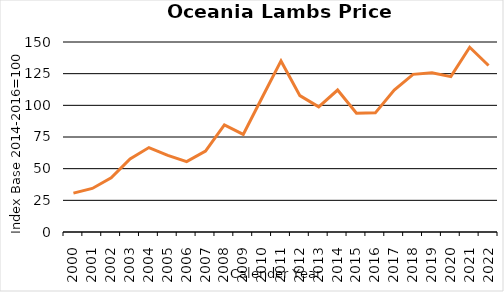
| Category | AU, NZ |
|---|---|
| 2000.0 | 30.663 |
| 2001.0 | 34.387 |
| 2002.0 | 42.754 |
| 2003.0 | 57.737 |
| 2004.0 | 66.657 |
| 2005.0 | 60.439 |
| 2006.0 | 55.515 |
| 2007.0 | 63.918 |
| 2008.0 | 84.597 |
| 2009.0 | 77.032 |
| 2010.0 | 106.15 |
| 2011.0 | 135.055 |
| 2012.0 | 107.658 |
| 2013.0 | 98.758 |
| 2014.0 | 112.087 |
| 2015.0 | 93.843 |
| 2016.0 | 94.069 |
| 2017.0 | 112.095 |
| 2018.0 | 124.437 |
| 2019.0 | 125.7 |
| 2020.0 | 122.681 |
| 2021.0 | 145.828 |
| 2022.0 | 131.456 |